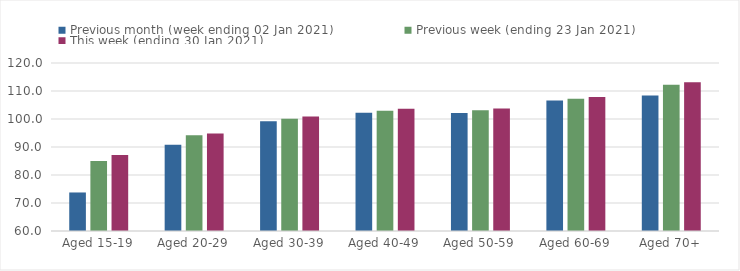
| Category | Previous month (week ending 02 Jan 2021) | Previous week (ending 23 Jan 2021) | This week (ending 30 Jan 2021) |
|---|---|---|---|
| Aged 15-19 | 73.76 | 84.98 | 87.16 |
| Aged 20-29 | 90.76 | 94.2 | 94.83 |
| Aged 30-39 | 99.2 | 100.11 | 100.89 |
| Aged 40-49 | 102.24 | 102.98 | 103.67 |
| Aged 50-59 | 102.1 | 103.1 | 103.78 |
| Aged 60-69 | 106.58 | 107.26 | 107.85 |
| Aged 70+ | 108.38 | 112.2 | 113.12 |